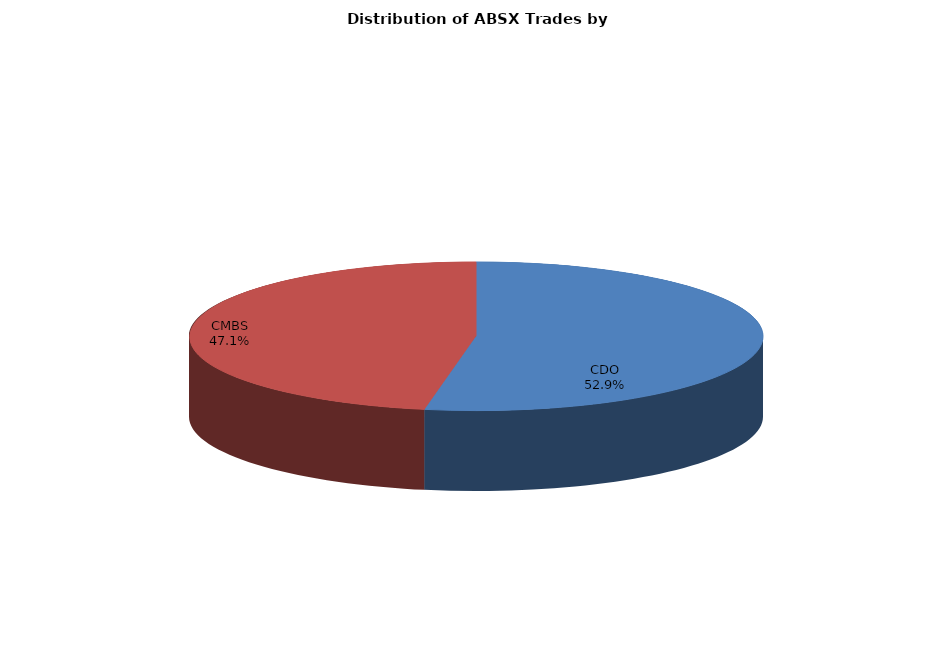
| Category | Series 0 |
|---|---|
| CDO | 233.052 |
| CMBS | 207.78 |